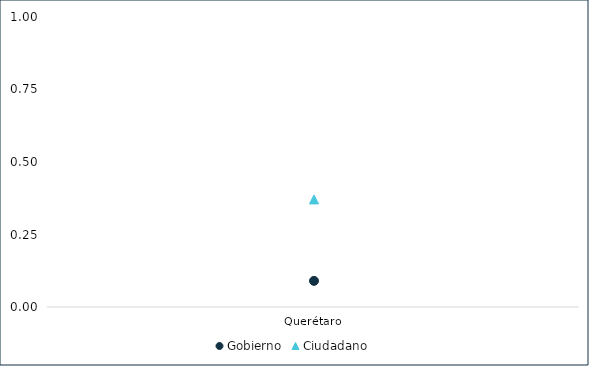
| Category | Gobierno | Ciudadano |
|---|---|---|
| Querétaro | 0.09 | 0.371 |